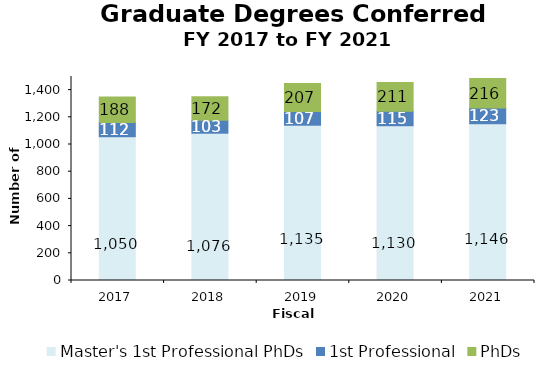
| Category | Master's 1st Professional PhDs | 1st Professional | PhDs |
|---|---|---|---|
| 2017.0 | 1050 | 112 | 188 |
| 2018.0 | 1076 | 103 | 172 |
| 2019.0 | 1135 | 107 | 207 |
| 2020.0 | 1130 | 115 | 211 |
| 2021.0 | 1146 | 123 | 216 |